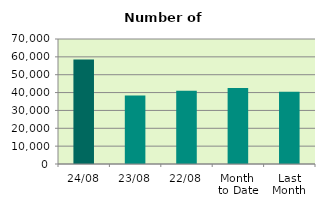
| Category | Series 0 |
|---|---|
| 24/08 | 58564 |
| 23/08 | 38332 |
| 22/08 | 40978 |
| Month 
to Date | 42524.556 |
| Last
Month | 40410.857 |